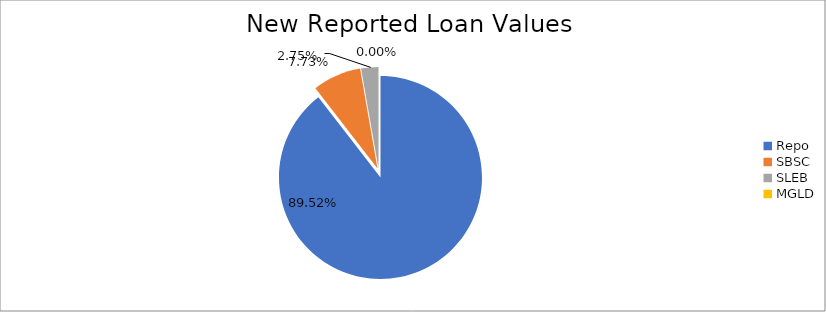
| Category | Series 0 |
|---|---|
| Repo | 11570548.214 |
| SBSC | 999273.814 |
| SLEB | 355107.776 |
| MGLD | 275.232 |